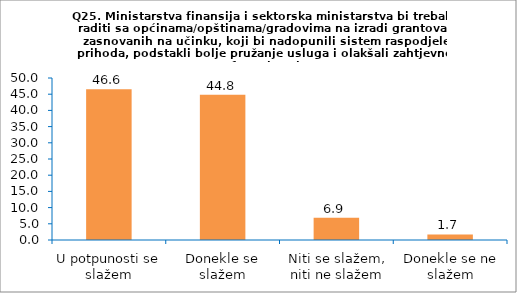
| Category | Series 0 |
|---|---|
| U potpunosti se slažem | 46.552 |
| Donekle se slažem | 44.828 |
| Niti se slažem, niti ne slažem | 6.897 |
| Donekle se ne slažem | 1.724 |